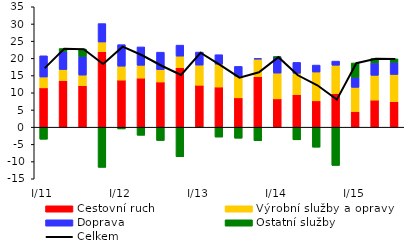
| Category | Cestovní ruch  | Výrobní služby a opravy | Doprava | Ostatní služby |
|---|---|---|---|---|
| I/11 | 11.431 | 3.156 | 6.162 | -3.509 |
| II | 13.528 | 3.236 | 5.236 | 0.875 |
| III | 12.037 | 3.104 | 5.449 | 2.149 |
| IV | 21.941 | 2.823 | 5.35 | -11.684 |
| I/12 | 13.692 | 4.048 | 6.252 | -0.513 |
| II | 14.269 | 3.724 | 5.341 | -2.361 |
| III | 13.14 | 3.585 | 5.083 | -3.885 |
| IV | 17.276 | 3.385 | 3.188 | -8.597 |
| I/13 | 12.195 | 5.852 | 3.788 | -0.133 |
| II | 11.675 | 6.652 | 2.738 | -2.878 |
| III | 8.529 | 6.323 | 2.82 | -3.214 |
| IV | 14.674 | 5.118 | 0.175 | -3.954 |
| I/14 | 8.232 | 7.495 | 4.681 | 0.01 |
| II | 9.456 | 6.213 | 3.163 | -3.68 |
| III | 7.658 | 8.378 | 2.02 | -5.821 |
| IV | 9.714 | 8.296 | 1.19 | -11.128 |
| I/15 | 4.536 | 7.05 | 2.884 | 4.192 |
| II | 7.874 | 7.201 | 3.612 | 1.265 |
| III | 7.413 | 7.919 | 3.535 | 1.001 |